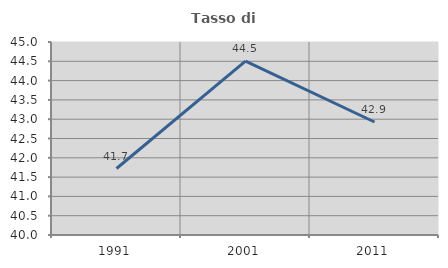
| Category | Tasso di occupazione   |
|---|---|
| 1991.0 | 41.722 |
| 2001.0 | 44.503 |
| 2011.0 | 42.927 |